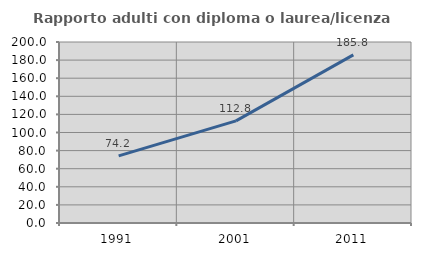
| Category | Rapporto adulti con diploma o laurea/licenza media  |
|---|---|
| 1991.0 | 74.206 |
| 2001.0 | 112.844 |
| 2011.0 | 185.787 |